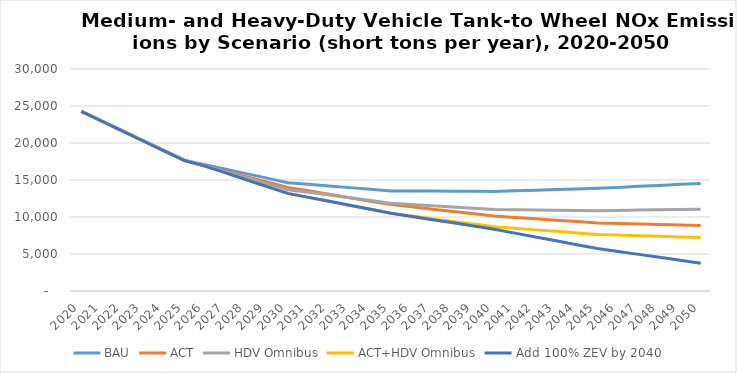
| Category | BAU | ACT | HDV Omnibus | ACT+HDV Omnibus | Add 100% ZEV by 2040 |
|---|---|---|---|---|---|
| 2020.0 | 24270 | 24270 | 24270 | 24270 | 24269.542 |
| 2021.0 | 22950 | 22940 | 22950 | 22950 | 22940 |
| 2022.0 | 21630 | 21610 | 21630 | 21630 | 21610 |
| 2023.0 | 20320 | 20270 | 20320 | 20320 | 20270 |
| 2024.0 | 19000 | 18940 | 19000 | 19000 | 18940 |
| 2025.0 | 17680 | 17610 | 17680 | 17610 | 17608.735 |
| 2026.0 | 17070 | 16890 | 16880 | 16880 | 16880 |
| 2027.0 | 16460 | 16170 | 16080 | 15960 | 15960 |
| 2028.0 | 15860 | 15440 | 15290 | 15040 | 15030 |
| 2029.0 | 15250 | 14720 | 14490 | 14110 | 14110 |
| 2030.0 | 14640 | 14000 | 13690 | 13190 | 13187.795 |
| 2031.0 | 14420 | 13540 | 13330 | 12650 | 12650 |
| 2032.0 | 14200 | 13070 | 12960 | 12120 | 12120 |
| 2033.0 | 13970 | 12610 | 12600 | 11580 | 11580 |
| 2034.0 | 13750 | 12140 | 12230 | 11050 | 11050 |
| 2035.0 | 13530 | 11680 | 11870 | 10510 | 10510.269 |
| 2036.0 | 13520 | 11370 | 11700 | 10140 | 10080 |
| 2037.0 | 13500 | 11060 | 11530 | 9770 | 9640 |
| 2038.0 | 13490 | 10740 | 11360 | 9410 | 9210 |
| 2039.0 | 13470 | 10430 | 11190 | 9040 | 8770 |
| 2040.0 | 13460 | 10120 | 11020 | 8670 | 8336.261 |
| 2041.0 | 13540 | 9940 | 10990 | 8470 | 7820 |
| 2042.0 | 13620 | 9750 | 10950 | 8260 | 7300 |
| 2043.0 | 13710 | 9570 | 10920 | 8060 | 6780 |
| 2044.0 | 13790 | 9380 | 10880 | 7850 | 6260 |
| 2045.0 | 13870 | 9200 | 10850 | 7650 | 5744.969 |
| 2046.0 | 14000 | 9130 | 10890 | 7560 | 5350 |
| 2047.0 | 14140 | 9060 | 10930 | 7480 | 4950 |
| 2048.0 | 14270 | 8980 | 10970 | 7390 | 4550 |
| 2049.0 | 14410 | 8910 | 11010 | 7310 | 4150 |
| 2050.0 | 14540 | 8840 | 11050 | 7220 | 3752.506 |